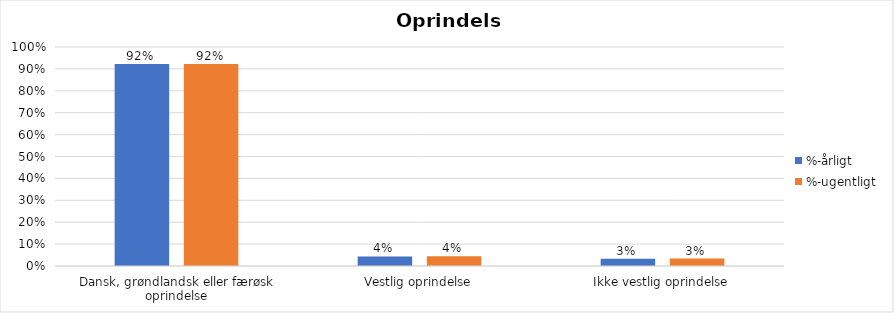
| Category | %-årligt | %-ugentligt |
|---|---|---|
| Dansk, grøndlandsk eller færøsk oprindelse | 0.923 | 0.922 |
| Vestlig oprindelse | 0.044 | 0.044 |
| Ikke vestlig oprindelse | 0.033 | 0.034 |